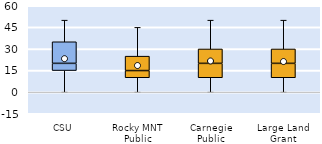
| Category | 25th | 50th | 75th |
|---|---|---|---|
| CSU | 15 | 5 | 15 |
| Rocky MNT Public | 10 | 5 | 10 |
| Carnegie Public | 10 | 10 | 10 |
| Large Land Grant | 10 | 10 | 10 |